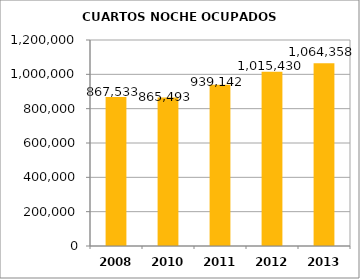
| Category | CUARTOS NOCHE OCUPADOS MENSUAL |
|---|---|
| 2008.0 | 867533 |
| 2010.0 | 865493 |
| 2011.0 | 939142 |
| 2012.0 | 1015430 |
| 2013.0 | 1064358 |